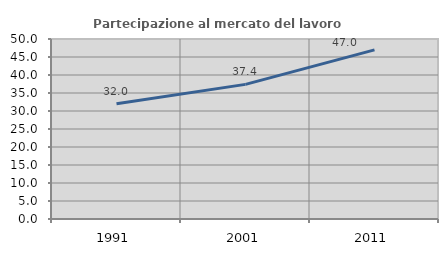
| Category | Partecipazione al mercato del lavoro  femminile |
|---|---|
| 1991.0 | 32.031 |
| 2001.0 | 37.398 |
| 2011.0 | 46.97 |